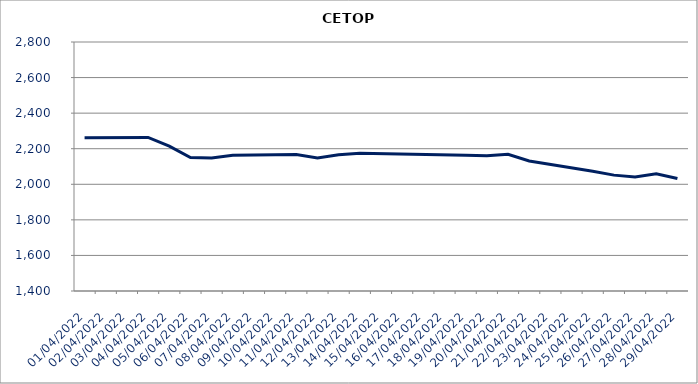
| Category | CETOP |
|---|---|
| 01/04/2022 | 2261.84 |
| 04/04/2022 | 2263.38 |
| 05/04/2022 | 2214.06 |
| 06/04/2022 | 2150.15 |
| 07/04/2022 | 2148.25 |
| 08/04/2022 | 2163.53 |
| 11/04/2022 | 2167.05 |
| 12/04/2022 | 2148.45 |
| 13/04/2022 | 2166.05 |
| 14/04/2022 | 2175 |
| 19/04/2022 | 2163.06 |
| 20/04/2022 | 2160.44 |
| 21/04/2022 | 2168.37 |
| 22/04/2022 | 2131.16 |
| 25/04/2022 | 2073.46 |
| 26/04/2022 | 2051.45 |
| 27/04/2022 | 2040.81 |
| 28/04/2022 | 2059.15 |
| 29/04/2022 | 2032.06 |